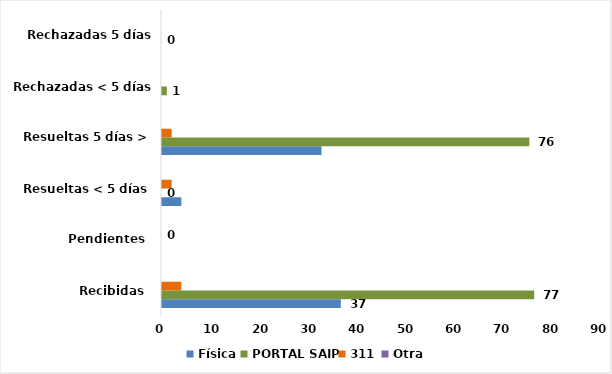
| Category | Física | PORTAL SAIP | 311 | Otra |
|---|---|---|---|---|
| Recibidas  | 37 | 77 | 4 | 0 |
| Pendientes  | 0 | 0 | 0 | 0 |
| Resueltas < 5 días | 4 | 0 | 2 | 0 |
| Resueltas 5 días > | 33 | 76 | 2 | 0 |
| Rechazadas < 5 días 2 | 0 | 1 | 0 | 0 |
| Rechazadas 5 días >3 | 0 | 0 | 0 | 0 |